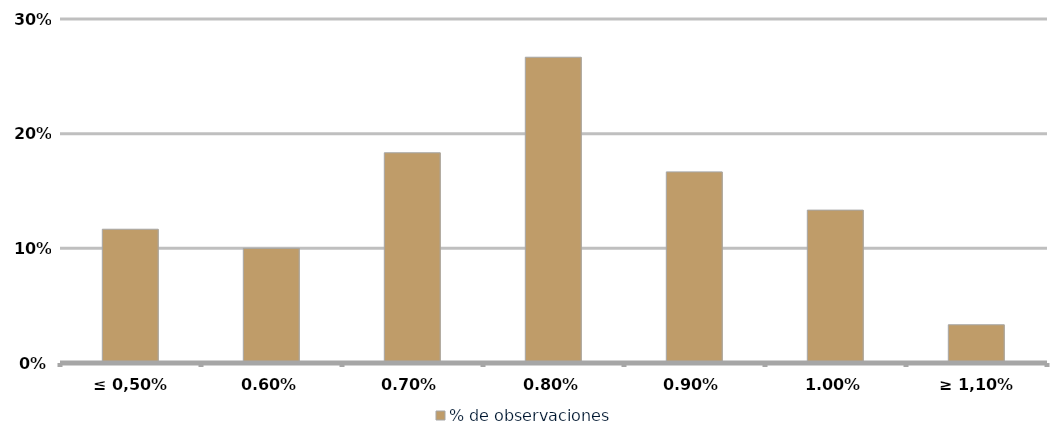
| Category | % de observaciones  |
|---|---|
| ≤ 0,50% | 0.117 |
| 0,60% | 0.1 |
| 0,70% | 0.183 |
| 0,80% | 0.267 |
| 0,90% | 0.167 |
| 1,00% | 0.133 |
| ≥ 1,10% | 0.033 |